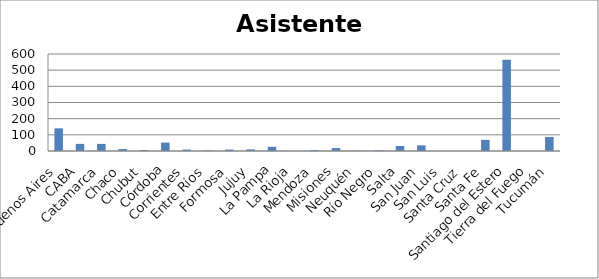
| Category | Series 0 |
|---|---|
| Buenos Aires | 140 |
| CABA | 44 |
| Catamarca | 44 |
| Chaco | 12 |
| Chubut | 6 |
| Córdoba | 52 |
| Corrientes | 9 |
| Entre Ríos | 3 |
| Formosa | 9 |
| Jujuy | 10 |
| La Pampa | 26 |
| La Rioja | 0 |
| Mendoza | 6 |
| Misiones | 18 |
| Neuquén | 2 |
| Río Negro | 4 |
| Salta | 31 |
| San Juan | 35 |
| San Luis | 0 |
| Santa Cruz | 0 |
| Santa Fe | 69 |
| Santiago del Estero | 565 |
| Tierra del Fuego | 0 |
| Tucumán | 87 |